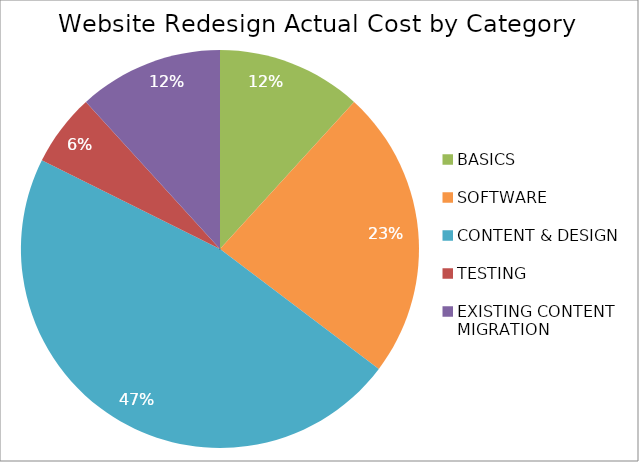
| Category | Actual |
|---|---|
| BASICS | 200 |
| SOFTWARE | 400 |
| CONTENT & DESIGN | 800 |
| TESTING | 100 |
| EXISTING CONTENT MIGRATION | 200 |